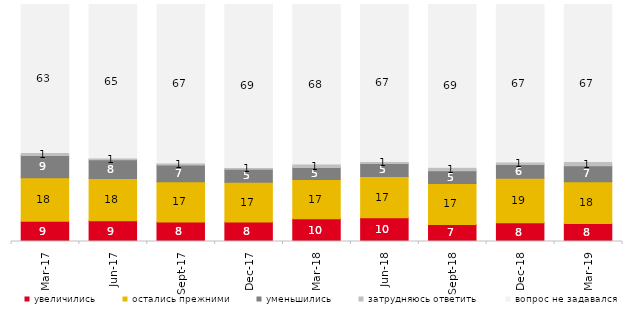
| Category | увеличились | остались прежними | уменьшились | затрудняюсь ответить | вопрос не задавался |
|---|---|---|---|---|---|
| 2017-03-01 | 8.5 | 18.35 | 9.4 | 0.95 | 62.8 |
| 2017-06-01 | 8.8 | 17.75 | 7.9 | 0.5 | 65.05 |
| 2017-09-01 | 8.2 | 17 | 7.1 | 0.5 | 67.2 |
| 2017-12-01 | 8.25 | 16.8 | 5.4 | 0.5 | 69.05 |
| 2018-03-01 | 9.55 | 16.65 | 5.05 | 1.1 | 67.65 |
| 2018-06-01 | 10 | 17.45 | 5.45 | 0.55 | 66.55 |
| 2018-09-01 | 7.2 | 17.3 | 5.3 | 1.2 | 69 |
| 2018-12-01 | 7.9 | 18.8 | 5.8 | 0.75 | 66.75 |
| 2019-03-01 | 7.608 | 17.653 | 6.713 | 1.343 | 66.683 |